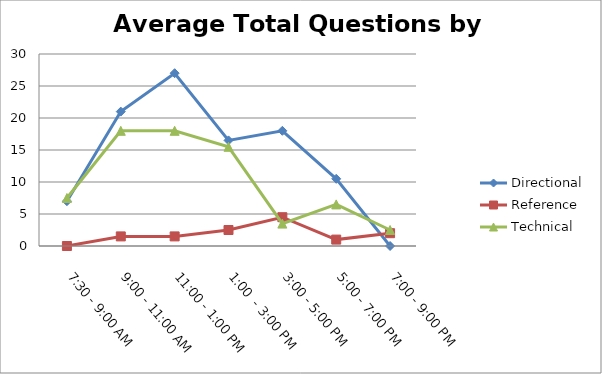
| Category | Directional | Reference | Technical |
|---|---|---|---|
| 7:30 - 9:00 AM | 7 | 0 | 7.5 |
| 9:00 - 11:00 AM | 21 | 1.5 | 18 |
| 11:00 - 1:00 PM | 27 | 1.5 | 18 |
| 1:00  - 3:00 PM | 16.5 | 2.5 | 15.5 |
| 3:00 - 5:00 PM | 18 | 4.5 | 3.5 |
| 5:00 - 7:00 PM | 10.5 | 1 | 6.5 |
| 7:00 - 9:00 PM | 0 | 2 | 2.5 |